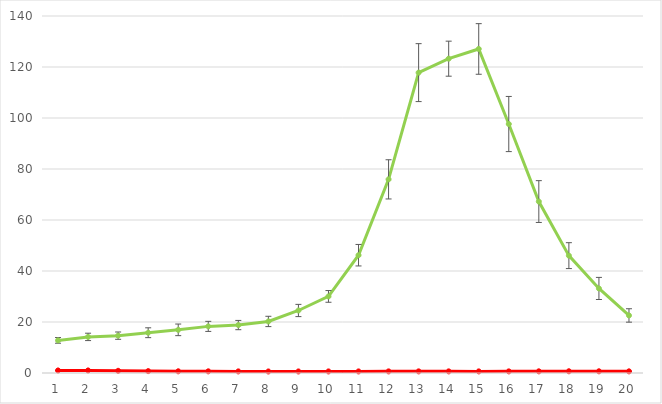
| Category | SMC3 | FISH |
|---|---|---|
| 0 | 1 | 12.788 |
| 1 | 1.006 | 14.156 |
| 2 | 0.861 | 14.646 |
| 3 | 0.739 | 15.793 |
| 4 | 0.673 | 16.922 |
| 5 | 0.661 | 18.281 |
| 6 | 0.636 | 18.798 |
| 7 | 0.605 | 20.217 |
| 8 | 0.613 | 24.516 |
| 9 | 0.624 | 30.036 |
| 10 | 0.626 | 46.195 |
| 11 | 0.637 | 75.936 |
| 12 | 0.643 | 117.795 |
| 13 | 0.641 | 123.264 |
| 14 | 0.637 | 127.077 |
| 15 | 0.641 | 97.636 |
| 16 | 0.66 | 67.233 |
| 17 | 0.685 | 46.028 |
| 18 | 0.674 | 33.155 |
| 19 | 0.65 | 22.567 |